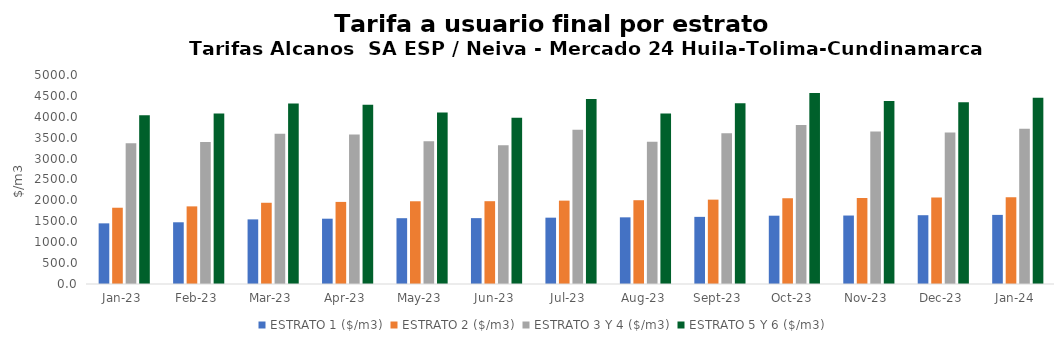
| Category | ESTRATO 1 ($/m3) | ESTRATO 2 ($/m3) | ESTRATO 3 Y 4 ($/m3) | ESTRATO 5 Y 6 ($/m3) |
|---|---|---|---|---|
| 2023-01-01 | 1450.9 | 1824.58 | 3365.49 | 4038.588 |
| 2023-02-01 | 1476.55 | 1857.05 | 3398.26 | 4077.912 |
| 2023-03-01 | 1545.84 | 1943.33 | 3596.1 | 4315.32 |
| 2023-04-01 | 1562.23 | 1963.79 | 3575.22 | 4290.264 |
| 2023-05-01 | 1574.25 | 1979.21 | 3416.65 | 4099.98 |
| 2023-06-01 | 1575.71 | 1980.83 | 3316.57 | 3979.884 |
| 2023-07-01 | 1586.9 | 1994.23 | 3689.81 | 4427.772 |
| 2023-08-01 | 1594.84 | 2004.4 | 3401.48 | 4081.776 |
| 2023-09-01 | 1606 | 2018.25 | 3603.59 | 4324.308 |
| 2023-10-01 | 1634.07 | 2053.24 | 3805.44 | 4566.528 |
| 2023-11-01 | 1638.05 | 2058.35 | 3648.51 | 4378.212 |
| 2023-12-01 | 1645.74 | 2067.85 | 3624.28 | 4349.136 |
| 2024-01-01 | 1653.34 | 2077.37 | 3712.73 | 4455.276 |